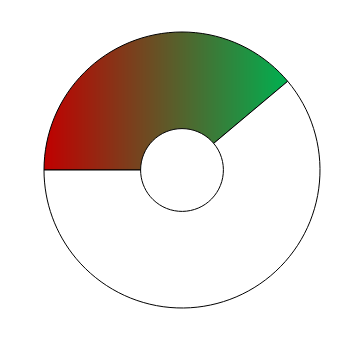
| Category | Series 0 |
|---|---|
| 0 | 140 |
| 1 | 220 |